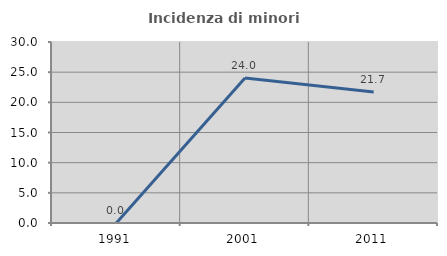
| Category | Incidenza di minori stranieri |
|---|---|
| 1991.0 | 0 |
| 2001.0 | 24.026 |
| 2011.0 | 21.724 |